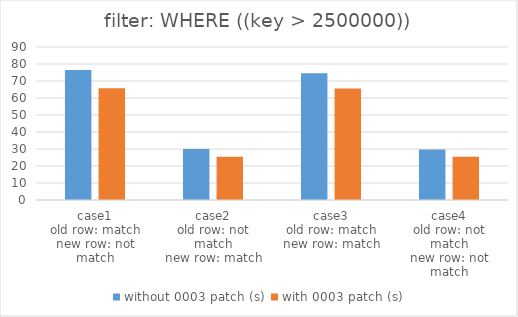
| Category | without 0003 patch (s) | with 0003 patch (s) |
|---|---|---|
| case1
old row: match
new row: not match | 76.53 | 65.78 |
| case2
old row: not match
new row: match | 29.96 | 25.43 |
| case3
old row: match
new row: match | 74.53 | 65.55 |
| case4
old row: not match
new row: not match | 29.72 | 25.41 |